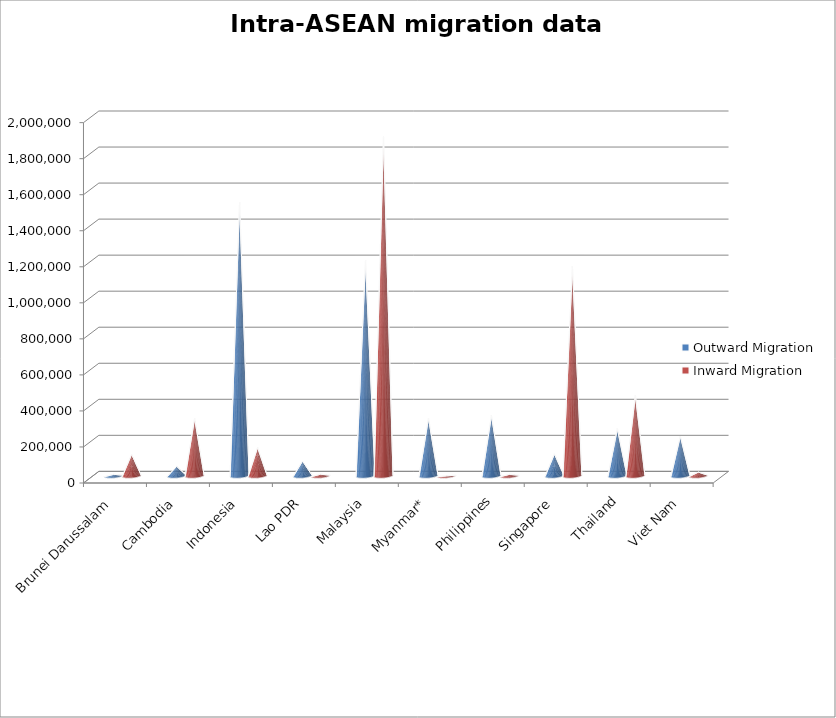
| Category | Outward Migration | Inward Migration |
|---|---|---|
| Brunei Darussalam | 9313 | 120578 |
| Cambodia | 53722 | 320573 |
| Indonesia | 1518687 | 158485 |
| Lao PDR | 82788 | 10134 |
| Malaysia | 1195566 | 1882987 |
| Myanmar* | 321100 | 814 |
| Philippines | 335407 | 9096 |
| Singapore | 122254 | 1162960 |
| Thailand | 262721 | 448218 |
| Viet Nam | 221956 | 21511 |